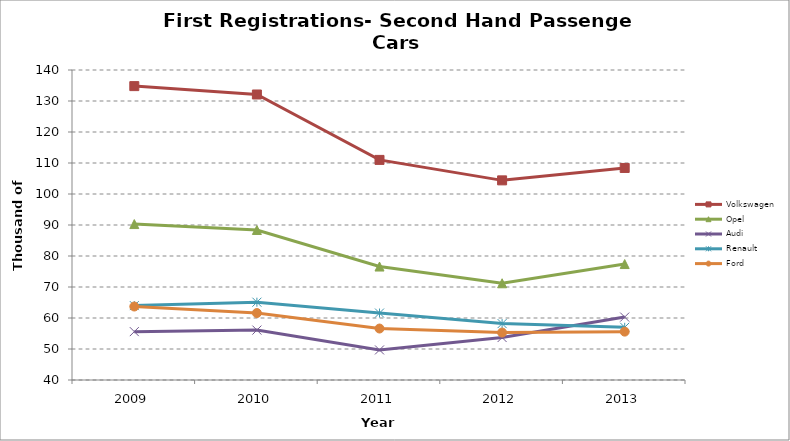
| Category | Volkswagen | Opel | Audi | Renault | Ford |
|---|---|---|---|---|---|
| 2009.0 | 134.8 | 90.3 | 55.6 | 64 | 63.7 |
| 2010.0 | 132.1 | 88.4 | 56.1 | 65.1 | 61.6 |
| 2011.0 | 111 | 76.6 | 49.7 | 61.6 | 56.6 |
| 2012.0 | 104.4 | 71.2 | 53.7 | 58.2 | 55.3 |
| 2013.0 | 108.4 | 77.4 | 60.3 | 57 | 55.6 |